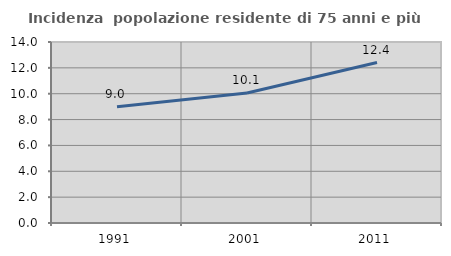
| Category | Incidenza  popolazione residente di 75 anni e più |
|---|---|
| 1991.0 | 8.99 |
| 2001.0 | 10.061 |
| 2011.0 | 12.409 |